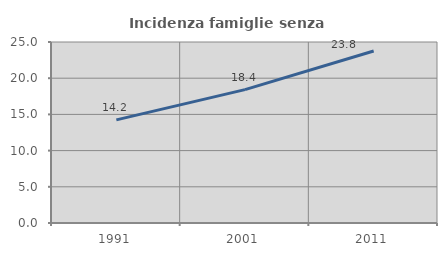
| Category | Incidenza famiglie senza nuclei |
|---|---|
| 1991.0 | 14.24 |
| 2001.0 | 18.424 |
| 2011.0 | 23.756 |